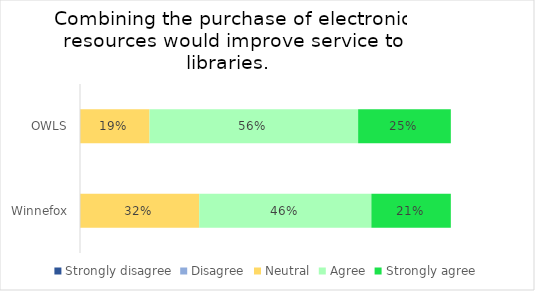
| Category | Strongly disagree | Disagree | Neutral | Agree | Strongly agree |
|---|---|---|---|---|---|
| OWLS | 0 | 0 | 0.188 | 0.562 | 0.25 |
| Winnefox | 0 | 0 | 0.321 | 0.464 | 0.214 |